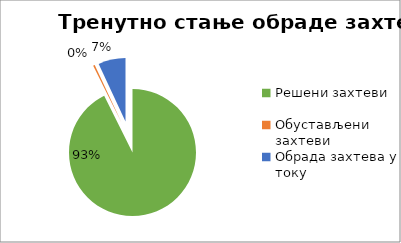
| Category | Series 0 |
|---|---|
| Решени захтеви | 35608 |
| Обустављени захтеви | 162 |
| Обрада захтева у току | 2666 |